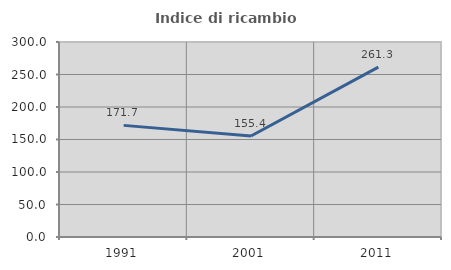
| Category | Indice di ricambio occupazionale  |
|---|---|
| 1991.0 | 171.724 |
| 2001.0 | 155.422 |
| 2011.0 | 261.345 |